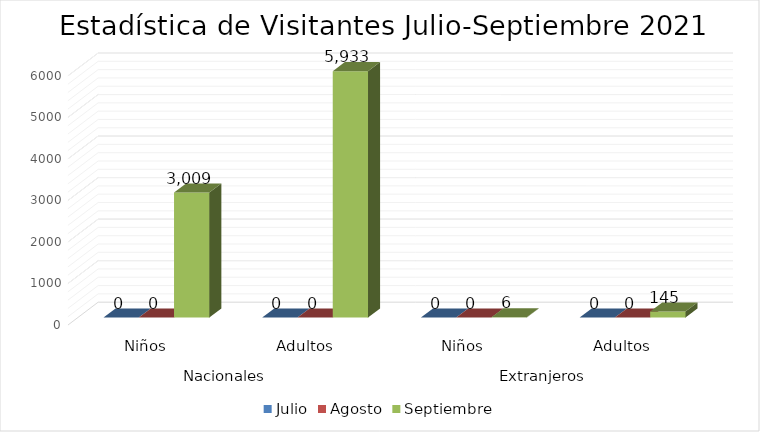
| Category | Julio | Agosto | Septiembre |
|---|---|---|---|
| 0 | 0 | 0 | 3009 |
| 1 | 0 | 0 | 5933 |
| 2 | 0 | 0 | 6 |
| 3 | 0 | 0 | 145 |